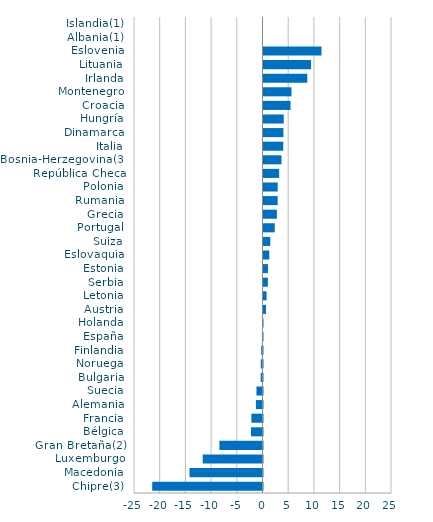
| Category | Series 0 |
|---|---|
| Chipre(3) | -21.457 |
| Macedonia | -14.202 |
| Luxemburgo | -11.635 |
| Gran Bretaña(2) | -8.382 |
| Bélgica | -2.231 |
| Francia | -2.162 |
| Alemania | -1.284 |
| Suecia | -1.176 |
| Bulgaria | -0.355 |
| Noruega | -0.326 |
| Finlandia | -0.251 |
| España | -0.113 |
| Holanda | -0.09 |
| Austria | 0.491 |
| Letonia | 0.598 |
| Serbia | 0.854 |
| Estonia | 0.867 |
| Eslovaquia | 1.123 |
| Suiza | 1.315 |
| Portugal | 2.189 |
| Grecia | 2.603 |
| Rumania | 2.754 |
| Polonia | 2.76 |
| República Checa | 3.046 |
| Bosnia-Herzegovina(3) | 3.5 |
| Italia | 3.843 |
| Dinamarca | 3.876 |
| Hungría | 3.938 |
| Croacia | 5.258 |
| Montenegro | 5.439 |
| Irlanda | 8.518 |
| Lituania | 9.25 |
| Eslovenia | 11.285 |
| Albania(1) | 0 |
| Islandia(1) | 0 |